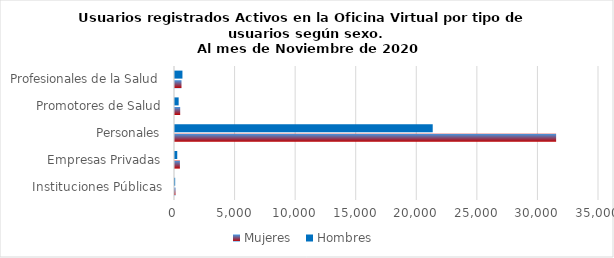
| Category | Mujeres | Hombres |
|---|---|---|
| Instituciones Públicas | 41 | 14 |
| Empresas Privadas | 405 | 186 |
| Personales | 31461 | 21274 |
| Promotores de Salud | 428 | 302 |
| Profesionales de la Salud | 536 | 614 |